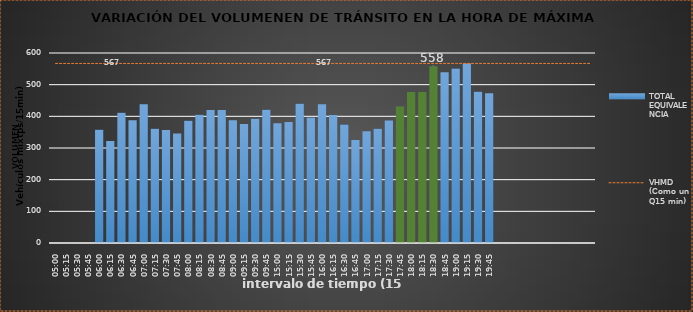
| Category | TOTAL EQUIVALENCIA   |
|---|---|
| 500.0 | 0 |
| 515.0 | 0 |
| 530.0 | 0 |
| 545.0 | 0 |
| 600.0 | 358 |
| 615.0 | 322 |
| 630.0 | 411 |
| 645.0 | 388 |
| 700.0 | 438 |
| 715.0 | 361 |
| 730.0 | 357 |
| 745.0 | 346 |
| 800.0 | 386 |
| 815.0 | 405 |
| 830.0 | 420 |
| 845.0 | 420 |
| 900.0 | 388 |
| 915.0 | 376 |
| 930.0 | 392 |
| 945.0 | 421 |
| 1500.0 | 378 |
| 1515.0 | 382 |
| 1530.0 | 440 |
| 1545.0 | 396 |
| 1600.0 | 438 |
| 1615.0 | 404 |
| 1630.0 | 374 |
| 1645.0 | 325 |
| 1700.0 | 353 |
| 1715.0 | 361 |
| 1730.0 | 387 |
| 1745.0 | 431 |
| 1800.0 | 477 |
| 1815.0 | 477 |
| 1830.0 | 558 |
| 1845.0 | 539 |
| 1900.0 | 551 |
| 1915.0 | 567 |
| 1930.0 | 478 |
| 1945.0 | 473 |